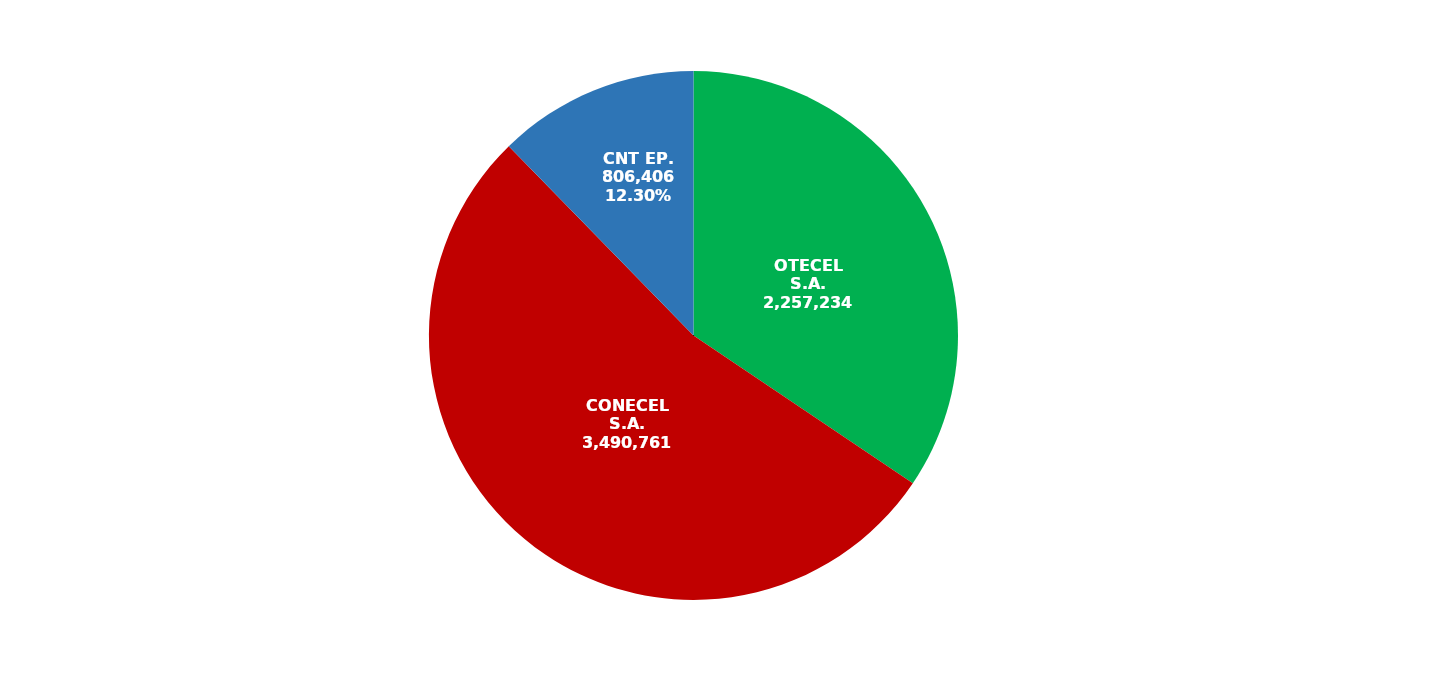
| Category | Series 0 |
|---|---|
| OTECEL S.A. | 2257234 |
| CONECEL S.A. | 3490761 |
| CNT EP. | 806406 |